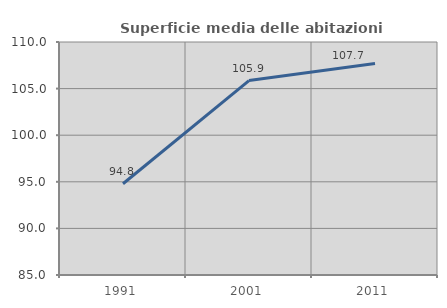
| Category | Superficie media delle abitazioni occupate |
|---|---|
| 1991.0 | 94.787 |
| 2001.0 | 105.861 |
| 2011.0 | 107.691 |